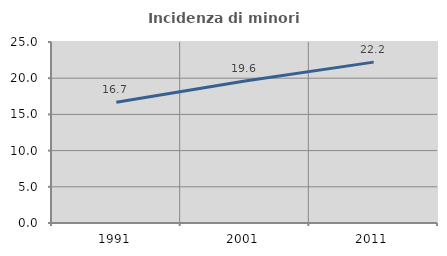
| Category | Incidenza di minori stranieri |
|---|---|
| 1991.0 | 16.667 |
| 2001.0 | 19.608 |
| 2011.0 | 22.222 |